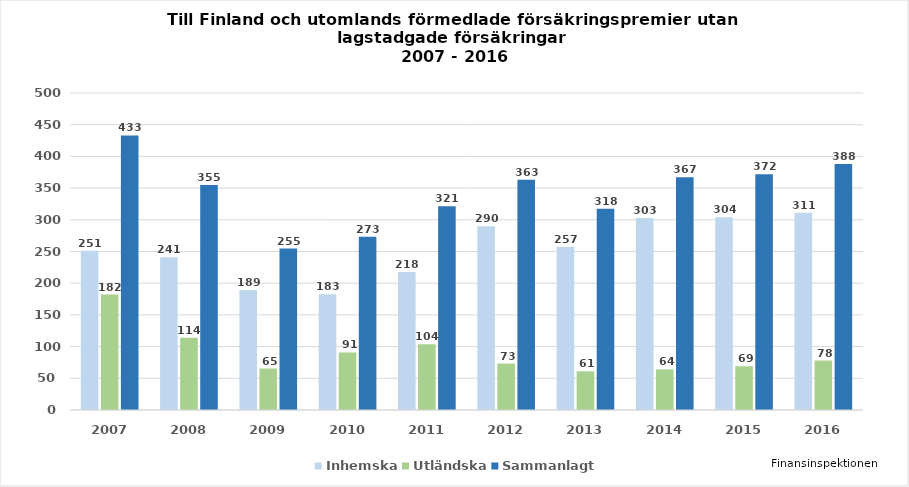
| Category | Inhemska | Utländska | Sammanlagt |
|---|---|---|---|
| 2007.0 | 251 | 182 | 433 |
| 2008.0 | 241 | 114 | 355 |
| 2009.0 | 189.249 | 65.417 | 254.666 |
| 2010.0 | 182.562 | 90.729 | 273.291 |
| 2011.0 | 217.55 | 103.894 | 321.444 |
| 2012.0 | 289.922 | 73.321 | 363.243 |
| 2013.0 | 257 | 61 | 317.523 |
| 2014.0 | 303 | 64 | 367 |
| 2015.0 | 304 | 69 | 372 |
| 2016.0 | 311 | 78 | 388 |